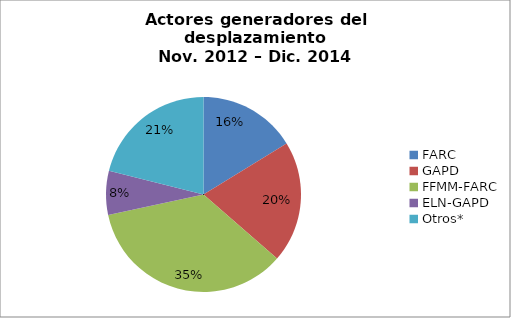
| Category | Series 0 |
|---|---|
| FARC | 0.162 |
| GAPD | 0.202 |
| FFMM-FARC | 0.352 |
| ELN-GAPD | 0.073 |
| Otros* | 0.211 |